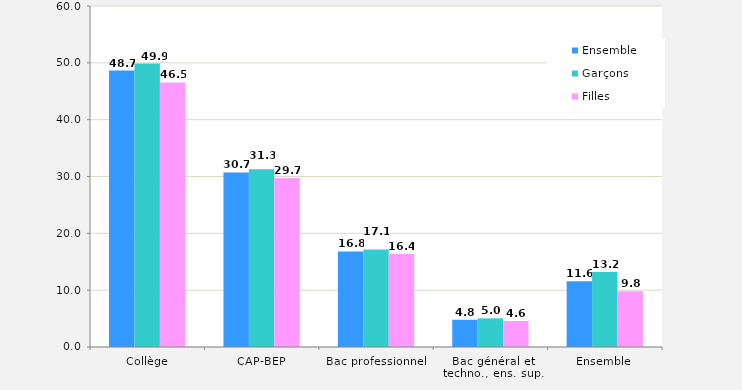
| Category | Ensemble | Garçons | Filles |
|---|---|---|---|
| Collège | 48.65 | 49.87 | 46.54 |
| CAP-BEP | 30.72 | 31.27 | 29.74 |
| Bac professionnel | 16.81 | 17.14 | 16.37 |
| Bac général et techno., ens. sup. | 4.79 | 5.04 | 4.57 |
| Ensemble | 11.556 | 13.213 | 9.829 |